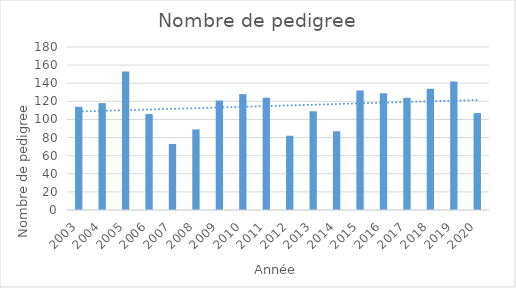
| Category | Series 0 |
|---|---|
| 2003.0 | 114 |
| 2004.0 | 118 |
| 2005.0 | 153 |
| 2006.0 | 106 |
| 2007.0 | 73 |
| 2008.0 | 89 |
| 2009.0 | 121 |
| 2010.0 | 128 |
| 2011.0 | 124 |
| 2012.0 | 82 |
| 2013.0 | 109 |
| 2014.0 | 87 |
| 2015.0 | 132 |
| 2016.0 | 129 |
| 2017.0 | 124 |
| 2018.0 | 134 |
| 2019.0 | 142 |
| 2020.0 | 107 |